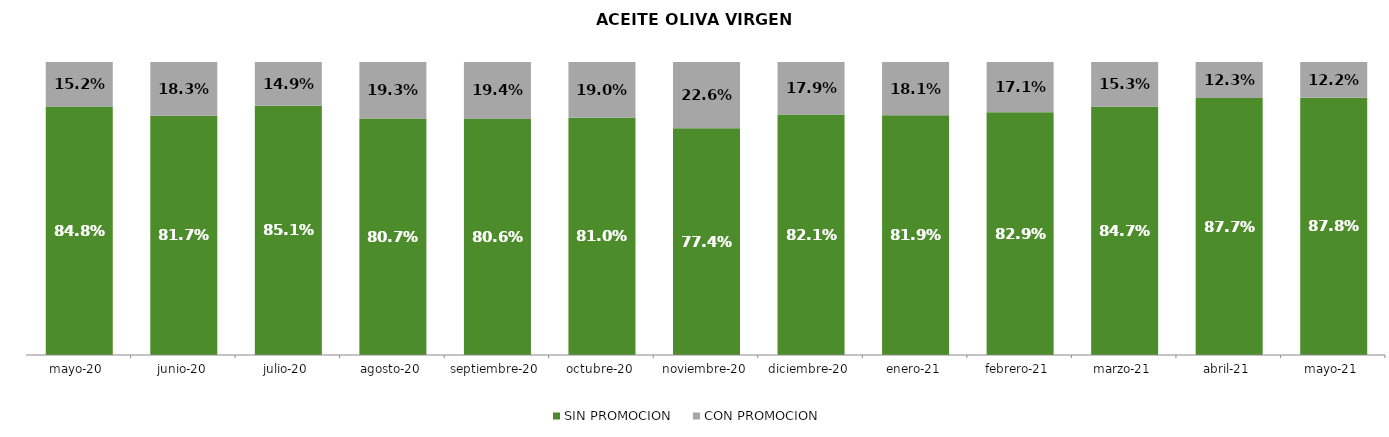
| Category | SIN PROMOCION   | CON PROMOCION   |
|---|---|---|
| 2020-05-01 | 0.848 | 0.152 |
| 2020-06-01 | 0.817 | 0.183 |
| 2020-07-01 | 0.851 | 0.149 |
| 2020-08-01 | 0.807 | 0.193 |
| 2020-09-01 | 0.806 | 0.194 |
| 2020-10-01 | 0.81 | 0.19 |
| 2020-11-01 | 0.774 | 0.226 |
| 2020-12-01 | 0.821 | 0.179 |
| 2021-01-01 | 0.819 | 0.181 |
| 2021-02-01 | 0.829 | 0.171 |
| 2021-03-01 | 0.847 | 0.153 |
| 2021-04-01 | 0.877 | 0.123 |
| 2021-05-01 | 0.878 | 0.122 |